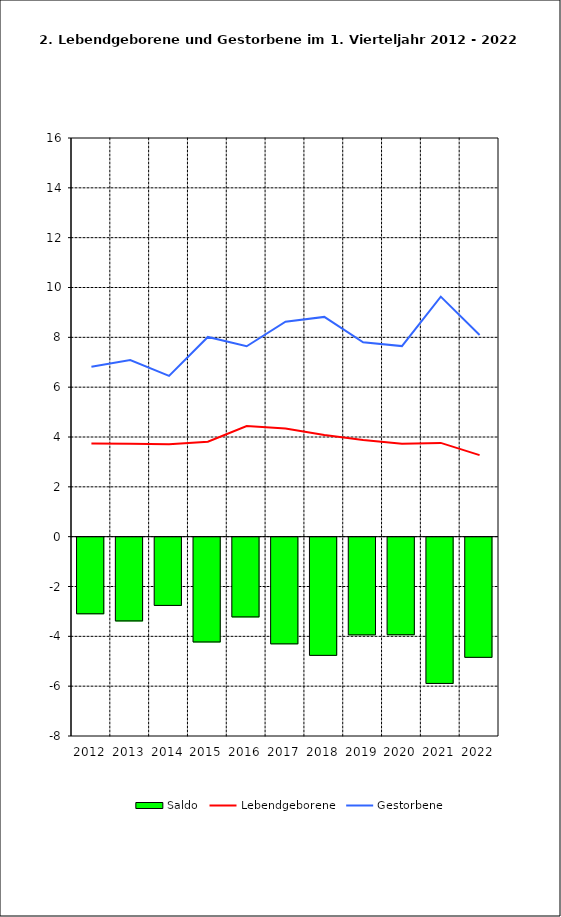
| Category | Saldo |
|---|---|
| 2011.0 | -3.075 |
| 2012.0 | -3.361 |
| 2013.0 | -2.739 |
| 2014.0 | -4.206 |
| 2015.0 | -3.2 |
| 2016.0 | -4.282 |
| 2017.0 | -4.744 |
| 2018.0 | -3.921 |
| 2019.0 | -3.916 |
| 2020.0 | -5.87 |
| 2021.0 | -4.823 |